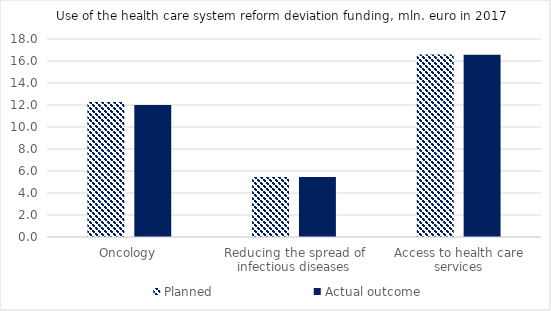
| Category | Planned | Actual outcome |
|---|---|---|
| Oncology | 12.262 | 12.005 |
| Reducing the spread of infectious diseases | 5.463 | 5.463 |
| Access to health care services | 16.599 | 16.564 |